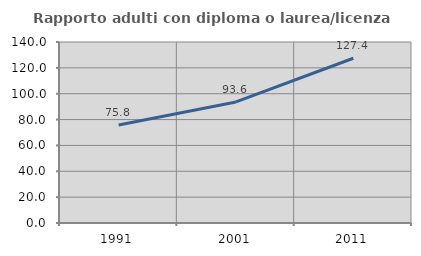
| Category | Rapporto adulti con diploma o laurea/licenza media  |
|---|---|
| 1991.0 | 75.839 |
| 2001.0 | 93.617 |
| 2011.0 | 127.411 |